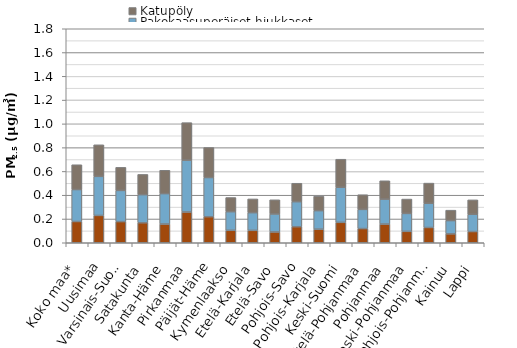
| Category | Työkoneiden pakokaasuperäiset hiukkaset | Pakokaasuperäiset hiukkaset | Katupöly |
|---|---|---|---|
| Koko maa* | 0.179 | 0.269 | 0.209 |
| Uusimaa | 0.23 | 0.329 | 0.265 |
| Varsinais-Suomi | 0.178 | 0.263 | 0.194 |
| Satakunta | 0.168 | 0.236 | 0.171 |
| Kanta-Häme | 0.158 | 0.255 | 0.197 |
| Pirkanmaa | 0.259 | 0.436 | 0.315 |
| Päijät-Häme | 0.219 | 0.33 | 0.253 |
| Kymenlaakso | 0.105 | 0.156 | 0.119 |
| Etelä-Karjala | 0.104 | 0.149 | 0.116 |
| Etelä-Savo | 0.091 | 0.151 | 0.119 |
| Pohjois-Savo | 0.135 | 0.21 | 0.156 |
| Pohjois-Karjala | 0.114 | 0.155 | 0.122 |
| Keski-Suomi | 0.172 | 0.295 | 0.236 |
| Etelä-Pohjanmaa | 0.119 | 0.161 | 0.123 |
| Pohjanmaa | 0.157 | 0.21 | 0.154 |
| Keski-Pohjanmaa | 0.096 | 0.151 | 0.121 |
| Pohjois-Pohjanmaa | 0.128 | 0.204 | 0.17 |
| Kainuu | 0.075 | 0.111 | 0.088 |
| Lappi | 0.094 | 0.146 | 0.121 |